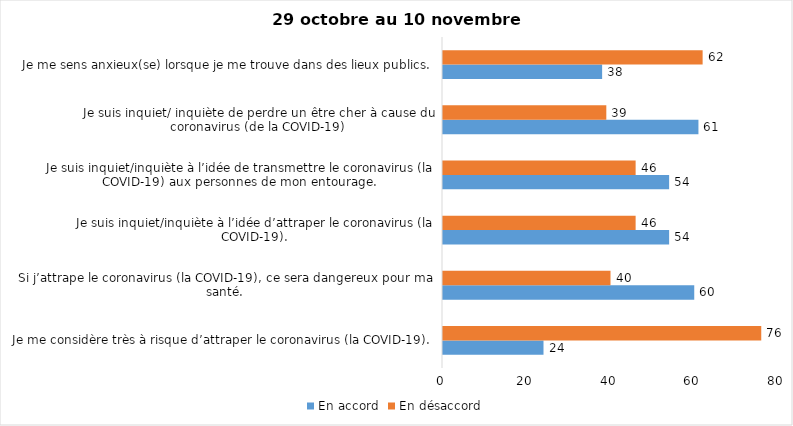
| Category | En accord | En désaccord |
|---|---|---|
| Je me considère très à risque d’attraper le coronavirus (la COVID-19). | 24 | 76 |
| Si j’attrape le coronavirus (la COVID-19), ce sera dangereux pour ma santé. | 60 | 40 |
| Je suis inquiet/inquiète à l’idée d’attraper le coronavirus (la COVID-19). | 54 | 46 |
| Je suis inquiet/inquiète à l’idée de transmettre le coronavirus (la COVID-19) aux personnes de mon entourage. | 54 | 46 |
| Je suis inquiet/ inquiète de perdre un être cher à cause du coronavirus (de la COVID-19) | 61 | 39 |
| Je me sens anxieux(se) lorsque je me trouve dans des lieux publics. | 38 | 62 |